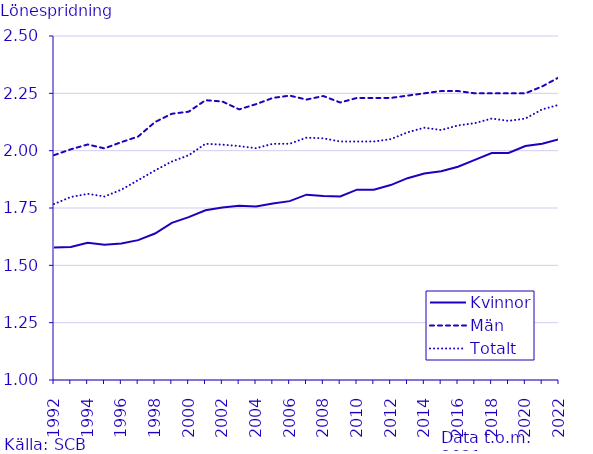
| Category | Kvinnor | Män | Totalt |
|---|---|---|---|
| 1992.0 | 1.578 | 1.98 | 1.768 |
| 1993.0 | 1.58 | 2.006 | 1.798 |
| 1994.0 | 1.598 | 2.027 | 1.812 |
| 1995.0 | 1.59 | 2.01 | 1.8 |
| 1996.0 | 1.596 | 2.037 | 1.83 |
| 1997.0 | 1.61 | 2.062 | 1.871 |
| 1998.0 | 1.639 | 2.125 | 1.914 |
| 1999.0 | 1.685 | 2.161 | 1.953 |
| 2000.0 | 1.71 | 2.17 | 1.98 |
| 2001.0 | 1.74 | 2.22 | 2.03 |
| 2002.0 | 1.752 | 2.214 | 2.026 |
| 2003.0 | 1.76 | 2.18 | 2.02 |
| 2004.0 | 1.756 | 2.203 | 2.011 |
| 2005.0 | 1.77 | 2.23 | 2.03 |
| 2006.0 | 1.78 | 2.24 | 2.03 |
| 2007.0 | 1.808 | 2.223 | 2.057 |
| 2008.0 | 1.802 | 2.238 | 2.054 |
| 2009.0 | 1.8 | 2.21 | 2.04 |
| 2010.0 | 1.83 | 2.23 | 2.04 |
| 2011.0 | 1.83 | 2.23 | 2.04 |
| 2012.0 | 1.85 | 2.23 | 2.05 |
| 2013.0 | 1.88 | 2.24 | 2.08 |
| 2014.0 | 1.9 | 2.25 | 2.1 |
| 2015.0 | 1.91 | 2.26 | 2.09 |
| 2016.0 | 1.93 | 2.26 | 2.11 |
| 2017.0 | 1.96 | 2.25 | 2.12 |
| 2018.0 | 1.99 | 2.25 | 2.14 |
| 2019.0 | 1.99 | 2.25 | 2.13 |
| 2020.0 | 2.02 | 2.25 | 2.14 |
| 2021.0 | 2.03 | 2.28 | 2.18 |
| 2022.0 | 2.05 | 2.32 | 2.2 |